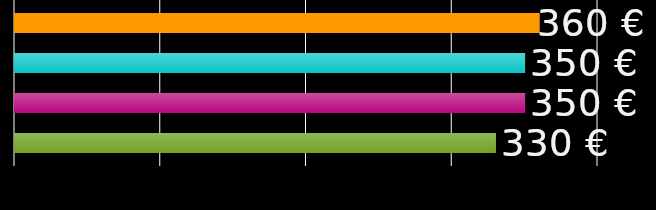
| Category | Mitbewohner 1 | Mitbewohner 2 | Mitbewohner 3 | Mitbewohner 4 |
|---|---|---|---|---|
| 0 | 360 | 350 | 350 | 330 |